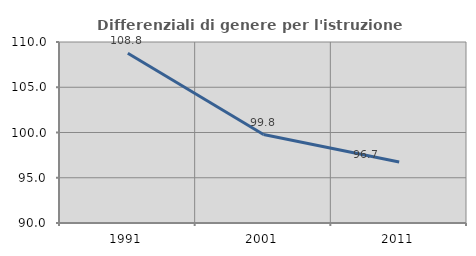
| Category | Differenziali di genere per l'istruzione superiore |
|---|---|
| 1991.0 | 108.763 |
| 2001.0 | 99.779 |
| 2011.0 | 96.742 |